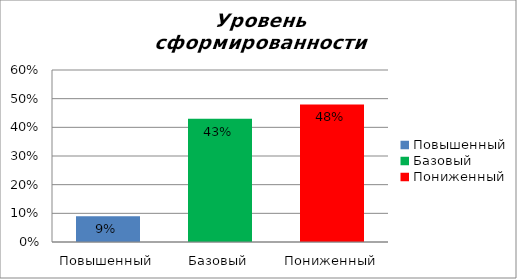
| Category | Уровень сформированности предметных результатов |
|---|---|
| Повышенный | 0.09 |
| Базовый | 0.43 |
| Пониженный | 0.48 |